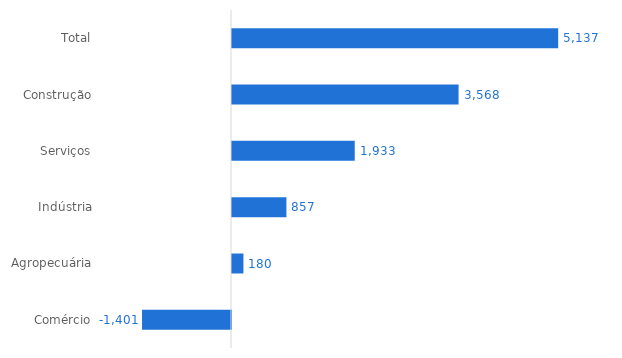
| Category | Espírito Santo |
|---|---|
| Total | 5137 |
| Construção | 3568 |
| Serviços | 1933 |
| Indústria | 857 |
| Agropecuária | 180 |
| Comércio | -1401 |